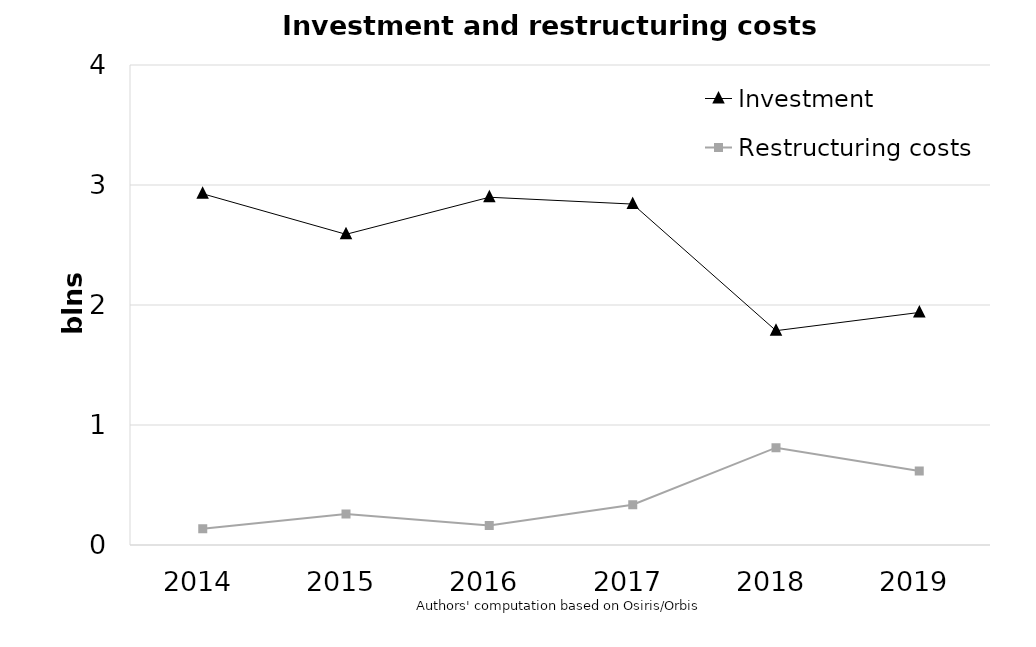
| Category | Investment |
|---|---|
| 2014.0 | 2.927 |
| 2015.0 | 2.589 |
| 2016.0 | 2.898 |
| 2017.0 | 2.841 |
| 2018.0 | 1.786 |
| 2019.0 | 1.938 |